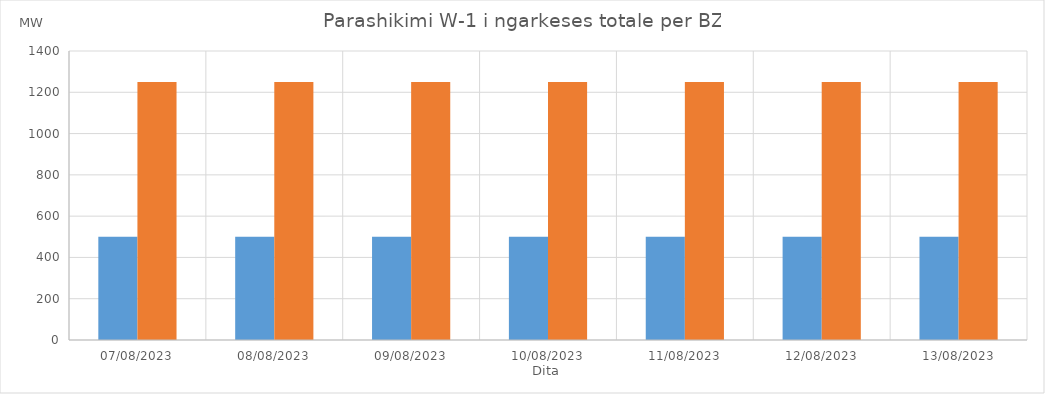
| Category | Min (MW) | Max (MW) |
|---|---|---|
| 07/08/2023 | 500 | 1250 |
| 08/08/2023 | 500 | 1250 |
| 09/08/2023 | 500 | 1250 |
| 10/08/2023 | 500 | 1250 |
| 11/08/2023 | 500 | 1250 |
| 12/08/2023 | 500 | 1250 |
| 13/08/2023 | 500 | 1250 |